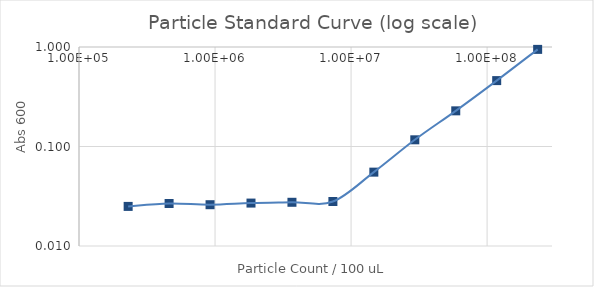
| Category | Series 1 |
|---|---|
| 235294117.64705887 | 0.946 |
| 117647058.82352944 | 0.46 |
| 58823529.41176472 | 0.228 |
| 29411764.70588236 | 0.117 |
| 14705882.35294118 | 0.055 |
| 7352941.17647059 | 0.028 |
| 3676470.588235295 | 0.028 |
| 1838235.2941176475 | 0.027 |
| 919117.6470588237 | 0.026 |
| 459558.82352941186 | 0.027 |
| 229779.41176470593 | 0.025 |